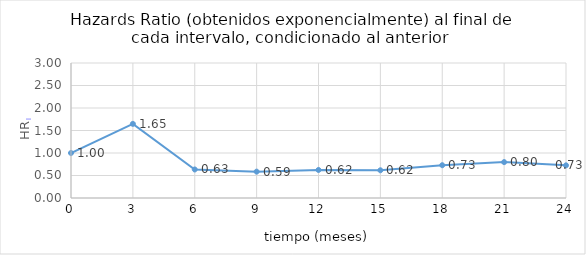
| Category | HRi |
|---|---|
| 0.0 | 1 |
| 3.0 | 1.648 |
| 6.0 | 0.634 |
| 9.0 | 0.585 |
| 12.0 | 0.623 |
| 15.0 | 0.616 |
| 18.0 | 0.729 |
| 21.0 | 0.798 |
| 24.0 | 0.726 |